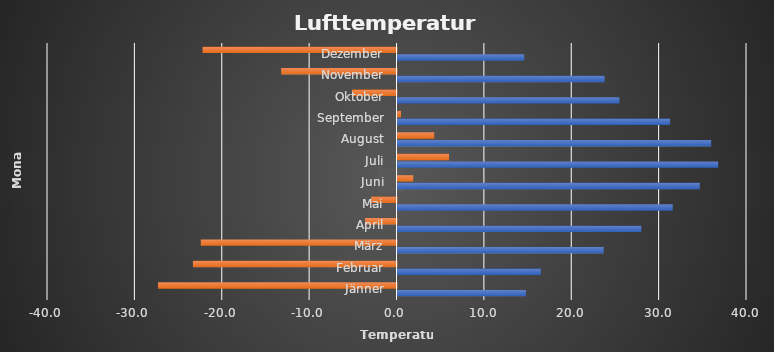
| Category | Series 0 | Series 1 |
|---|---|---|
| Jänner | 14.7 | -27.3 |
| Februar | 16.4 | -23.3 |
| März | 23.6 | -22.4 |
| April | 27.9 | -3.6 |
| Mai | 31.5 | -2.9 |
| Juni | 34.6 | 1.8 |
| Juli | 36.7 | 5.9 |
| August | 35.9 | 4.2 |
| September | 31.2 | 0.4 |
| Oktober | 25.4 | -5.1 |
| November | 23.7 | -13.2 |
| Dezember | 14.5 | -22.2 |